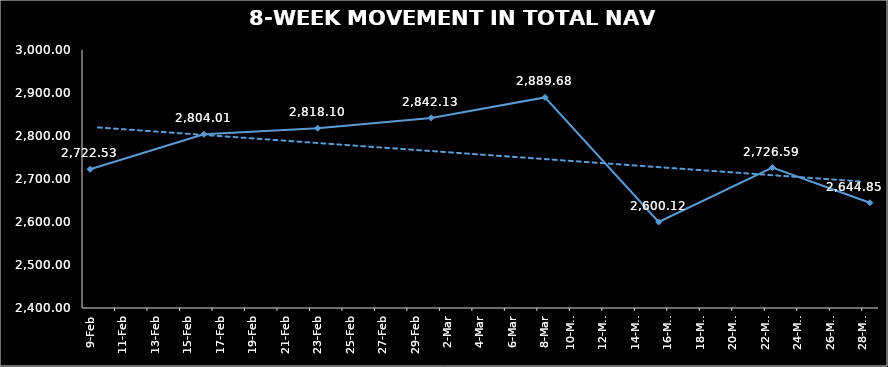
| Category | TOTAL NAV |
|---|---|
| 2024-02-09 | 2722.532 |
| 2024-02-16 | 2804.014 |
| 2024-02-23 | 2818.099 |
| 2024-03-01 | 2842.127 |
| 2024-03-08 | 2889.675 |
| 2024-03-15 | 2600.12 |
| 2024-03-22 | 2726.59 |
| 2024-03-28 | 2644.848 |